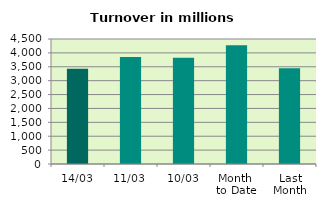
| Category | Series 0 |
|---|---|
| 14/03 | 3425.818 |
| 11/03 | 3849.287 |
| 10/03 | 3828.49 |
| Month 
to Date | 4271.901 |
| Last
Month | 3445.759 |